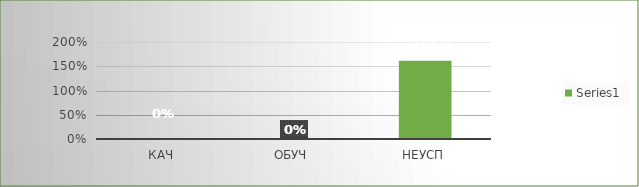
| Category | Series 0 |
|---|---|
| кач | 0 |
| обуч | 0 |
| неусп | 1.611 |